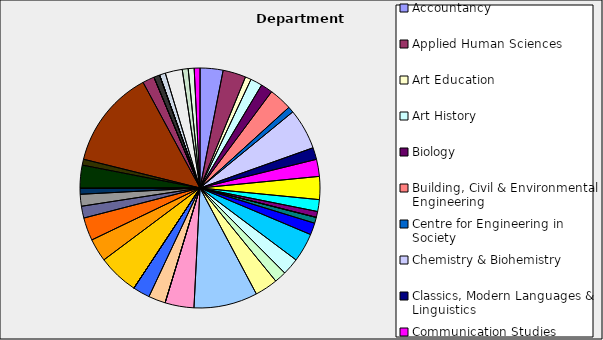
| Category | Series 0 |
|---|---|
| Accountancy | 0.031 |
| Applied Human Sciences | 0.031 |
| Art Education | 0.008 |
| Art History | 0.016 |
| Biology | 0.016 |
| Building, Civil & Environmental Engineering | 0.031 |
| Centre for Engineering in Society | 0.008 |
| Chemistry & Biohemistry | 0.055 |
| Classics, Modern Languages & Linguistics | 0.016 |
| Communication Studies | 0.023 |
| Computer Science & Software Engineering | 0.031 |
| Concordia Institute for Information Systems Engineering | 0.016 |
| Contemporary Dance | 0.008 |
| Creative Arts Therapies | 0 |
| Design & Computation Arts | 0.008 |
| Economics | 0.016 |
| Education | 0.039 |
| Electrical & Computer Engineering | 0.023 |
| English | 0.016 |
| Études françaises | 0.031 |
| Exercise Science | 0.086 |
| Finance | 0.039 |
| Geography, Planning & Environment | 0 |
| History | 0.023 |
| Journalism | 0.023 |
| Liberal Arts College | 0 |
| Loyola College for Diversity and Sustainability | 0 |
| Management | 0.055 |
| Marketing | 0.031 |
| Mathematics & Statistics | 0.031 |
| Mechanical & Industrial Engineering | 0.016 |
| Mel Hoppenheim School of Cinema | 0.016 |
| Music | 0.008 |
| Philosophy | 0 |
| Physics | 0.031 |
| Political Science | 0.008 |
| Psychology | 0.133 |
| Religion | 0.016 |
| School of Canadian Irish Studies | 0 |
| School of Community & Public Affairs | 0.008 |
| Science College | 0 |
| Simone de Beauvoir Institute | 0 |
| Sociology & Anthropology | 0.008 |
| Studio Arts | 0.023 |
| Supply Chain & Business Technology Management | 0.008 |
| Theatre | 0.008 |
| Theological Studies | 0.008 |